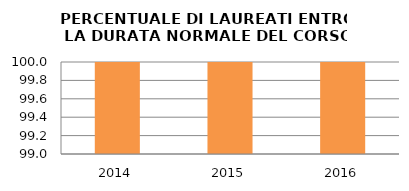
| Category | 2014 2015 2016 |
|---|---|
| 2014.0 | 100 |
| 2015.0 | 100 |
| 2016.0 | 100 |